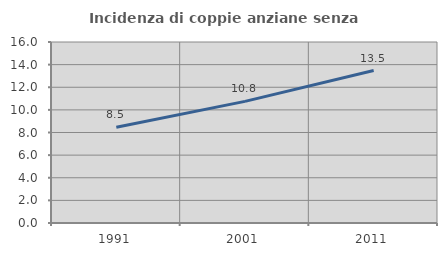
| Category | Incidenza di coppie anziane senza figli  |
|---|---|
| 1991.0 | 8.471 |
| 2001.0 | 10.751 |
| 2011.0 | 13.474 |